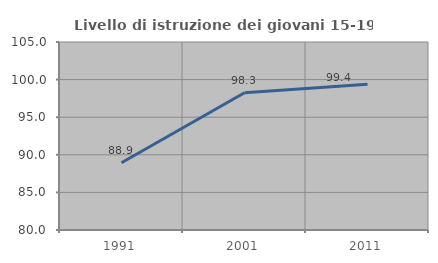
| Category | Livello di istruzione dei giovani 15-19 anni |
|---|---|
| 1991.0 | 88.936 |
| 2001.0 | 98.252 |
| 2011.0 | 99.374 |